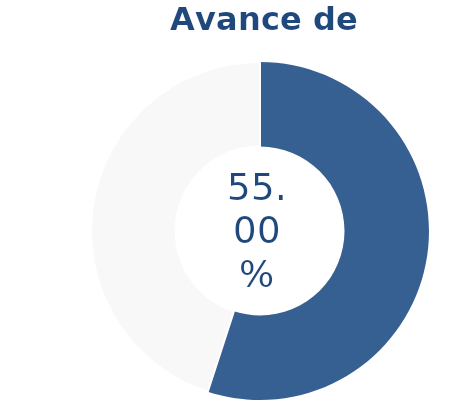
| Category | Series 0 |
|---|---|
| Acumulado 1 Trimestre | 0.55 |
| Año | -0.45 |